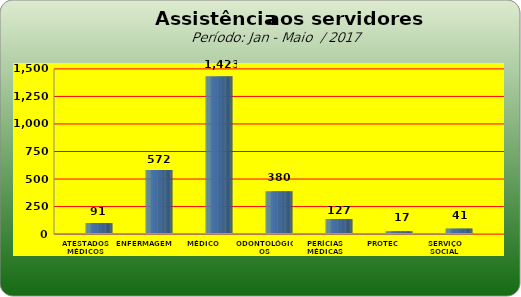
| Category | Series 0 |
|---|---|
| ATESTADOS MÉDICOS | 91 |
| ENFERMAGEM | 572 |
| MÉDICO | 1423 |
| ODONTOLÓGICOS | 380 |
| PERÍCIAS MÉDICAS | 127 |
| PROTEC | 17 |
| SERVIÇO SOCIAL | 41 |